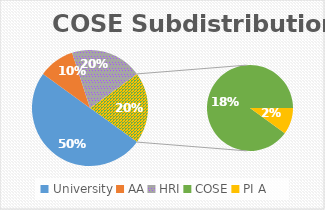
| Category | Series 0 |
|---|---|
| University | 0.5 |
| AA | 0.1 |
| HRI | 0.2 |
| COSE | 0.18 |
| PI A | 0.02 |